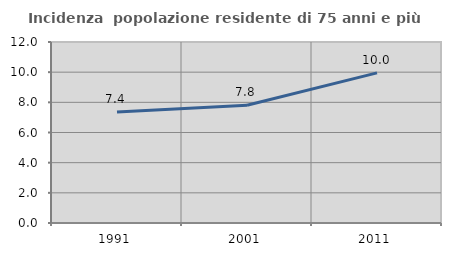
| Category | Incidenza  popolazione residente di 75 anni e più |
|---|---|
| 1991.0 | 7.357 |
| 2001.0 | 7.807 |
| 2011.0 | 9.953 |